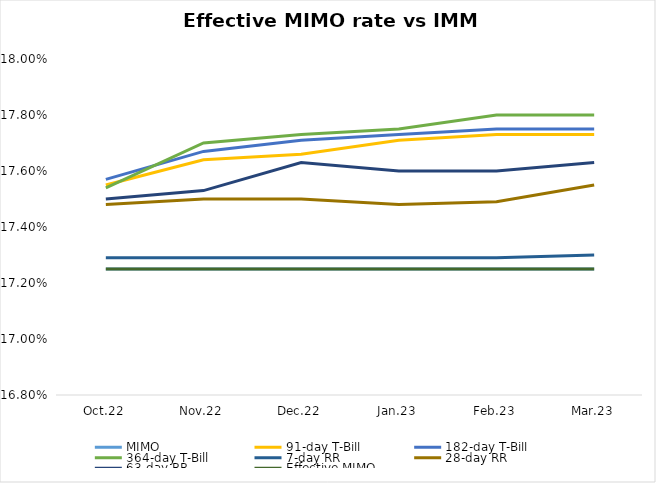
| Category | MIMO | 91-day T-Bill | 182-day T-Bill | 364-day T-Bill | 7-day RR | 28-day RR | 63-day RR | Effective MIMO |
|---|---|---|---|---|---|---|---|---|
| Oct.22 | 0.172 | 0.176 | 0.176 | 0.175 | 0.173 | 0.175 | 0.175 | 0.172 |
| Nov.22 | 0.172 | 0.176 | 0.177 | 0.177 | 0.173 | 0.175 | 0.175 | 0.172 |
| Dec.22 | 0.172 | 0.177 | 0.177 | 0.177 | 0.173 | 0.175 | 0.176 | 0.172 |
| Jan.23 | 0.172 | 0.177 | 0.177 | 0.178 | 0.173 | 0.175 | 0.176 | 0.172 |
| Feb.23 | 0.172 | 0.177 | 0.178 | 0.178 | 0.173 | 0.175 | 0.176 | 0.172 |
| Mar.23 | 0.172 | 0.177 | 0.178 | 0.178 | 0.173 | 0.176 | 0.176 | 0.172 |